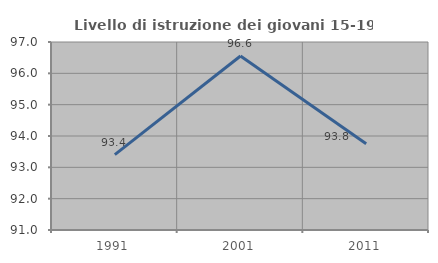
| Category | Livello di istruzione dei giovani 15-19 anni |
|---|---|
| 1991.0 | 93.407 |
| 2001.0 | 96.552 |
| 2011.0 | 93.75 |